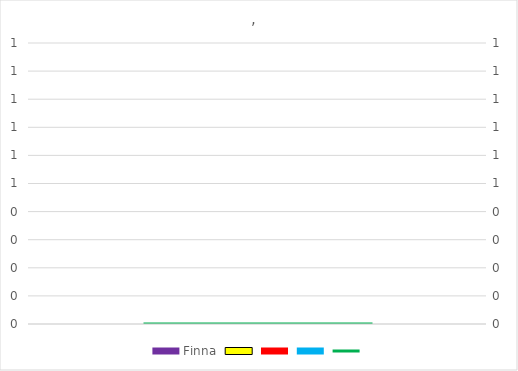
| Category | Finna | Series 1 | Series 2 | Series 3 |
|---|---|---|---|---|
| 0 | 0 | 0 | 0 | 0 |
| 1 | 0 | 0 | 0 | 0 |